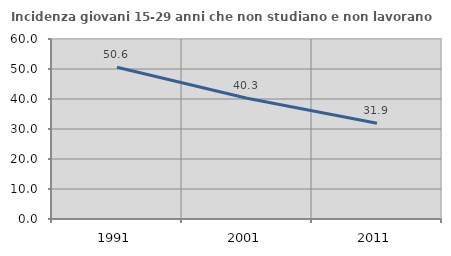
| Category | Incidenza giovani 15-29 anni che non studiano e non lavorano  |
|---|---|
| 1991.0 | 50.602 |
| 2001.0 | 40.262 |
| 2011.0 | 31.886 |